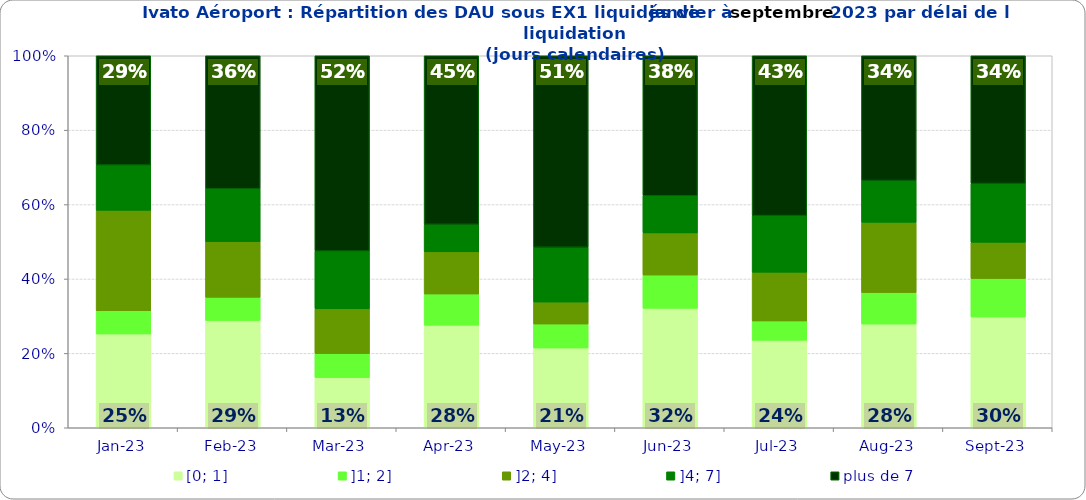
| Category | [0; 1] | ]1; 2] | ]2; 4] | ]4; 7] | plus de 7 |
|---|---|---|---|---|---|
| 2023-01-01 | 0.252 | 0.062 | 0.27 | 0.122 | 0.294 |
| 2023-02-01 | 0.288 | 0.062 | 0.149 | 0.142 | 0.358 |
| 2023-03-01 | 0.135 | 0.065 | 0.12 | 0.155 | 0.525 |
| 2023-04-01 | 0.276 | 0.084 | 0.113 | 0.074 | 0.453 |
| 2023-05-01 | 0.214 | 0.064 | 0.059 | 0.147 | 0.515 |
| 2023-06-01 | 0.321 | 0.089 | 0.113 | 0.1 | 0.376 |
| 2023-07-01 | 0.235 | 0.052 | 0.131 | 0.152 | 0.43 |
| 2023-08-01 | 0.279 | 0.085 | 0.189 | 0.113 | 0.335 |
| 2023-09-01 | 0.298 | 0.103 | 0.097 | 0.158 | 0.343 |